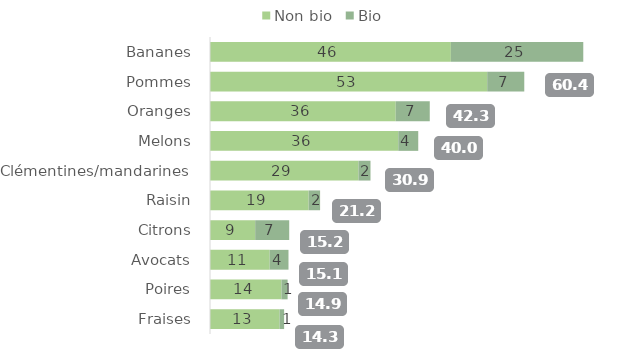
| Category | Non bio | Bio |
|---|---|---|
| Bananes | 46.319 | 25.465 |
| Pommes | 53.308 | 7.13 |
| Oranges | 35.714 | 6.548 |
| Melons | 36.206 | 3.842 |
| Clémentines/mandarines | 28.549 | 2.316 |
| Raisin | 18.971 | 2.203 |
| Citrons | 8.688 | 6.545 |
| Avocats | 11.475 | 3.62 |
| Poires | 13.743 | 1.184 |
| Fraises | 13.384 | 0.873 |